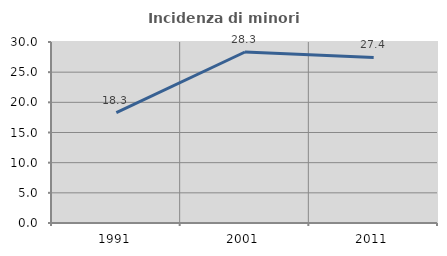
| Category | Incidenza di minori stranieri |
|---|---|
| 1991.0 | 18.28 |
| 2001.0 | 28.342 |
| 2011.0 | 27.439 |